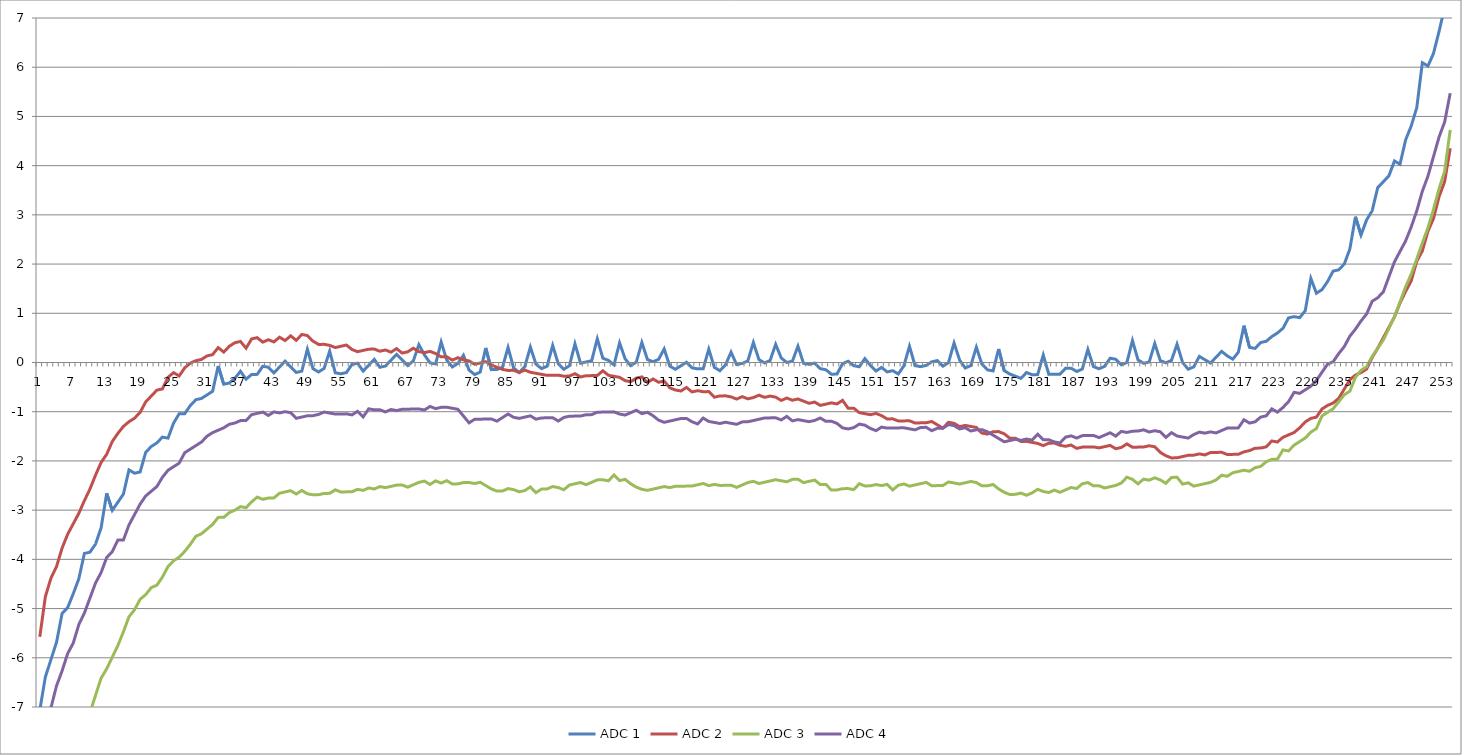
| Category | ADC 1 | ADC 2 | ADC 3 | ADC 4 |
|---|---|---|---|---|
| 0 | -7.067 | -5.575 | -10.797 | -7.813 |
| 1 | -6.389 | -4.757 | -9.909 | -7.368 |
| 2 | -6.037 | -4.382 | -9.487 | -7.016 |
| 3 | -5.685 | -4.147 | -9.042 | -6.571 |
| 4 | -5.1 | -3.771 | -8.69 | -6.266 |
| 5 | -4.981 | -3.489 | -8.338 | -5.914 |
| 6 | -4.699 | -3.277 | -8.032 | -5.701 |
| 7 | -4.394 | -3.065 | -7.634 | -5.326 |
| 8 | -3.879 | -2.807 | -7.398 | -5.091 |
| 9 | -3.853 | -2.571 | -7.116 | -4.786 |
| 10 | -3.688 | -2.289 | -6.765 | -4.48 |
| 11 | -3.359 | -2.03 | -6.413 | -4.268 |
| 12 | -2.657 | -1.865 | -6.224 | -3.963 |
| 13 | -3.005 | -1.606 | -5.988 | -3.844 |
| 14 | -2.839 | -1.441 | -5.753 | -3.609 |
| 15 | -2.674 | -1.299 | -5.471 | -3.606 |
| 16 | -2.182 | -1.203 | -5.166 | -3.301 |
| 17 | -2.25 | -1.131 | -5.024 | -3.089 |
| 18 | -2.224 | -1.012 | -4.811 | -2.877 |
| 19 | -1.826 | -0.8 | -4.716 | -2.711 |
| 20 | -1.707 | -0.681 | -4.574 | -2.616 |
| 21 | -1.635 | -0.562 | -4.525 | -2.52 |
| 22 | -1.516 | -0.537 | -4.359 | -2.331 |
| 23 | -1.537 | -0.301 | -4.147 | -2.189 |
| 24 | -1.231 | -0.206 | -4.028 | -2.117 |
| 25 | -1.043 | -0.273 | -3.956 | -2.045 |
| 26 | -1.04 | -0.108 | -3.837 | -1.833 |
| 27 | -0.875 | -0.012 | -3.695 | -1.761 |
| 28 | -0.756 | 0.037 | -3.53 | -1.688 |
| 29 | -0.73 | 0.062 | -3.481 | -1.616 |
| 30 | -0.658 | 0.134 | -3.385 | -1.497 |
| 31 | -0.586 | 0.16 | -3.29 | -1.425 |
| 32 | -0.071 | 0.302 | -3.148 | -1.376 |
| 33 | -0.441 | 0.211 | -3.145 | -1.327 |
| 34 | -0.416 | 0.33 | -3.05 | -1.255 |
| 35 | -0.32 | 0.402 | -3.001 | -1.229 |
| 36 | -0.178 | 0.428 | -2.929 | -1.18 |
| 37 | -0.339 | 0.29 | -2.95 | -1.178 |
| 38 | -0.244 | 0.479 | -2.831 | -1.059 |
| 39 | -0.241 | 0.505 | -2.735 | -1.034 |
| 40 | -0.076 | 0.414 | -2.78 | -1.008 |
| 41 | -0.097 | 0.463 | -2.754 | -1.076 |
| 42 | -0.211 | 0.418 | -2.752 | -1.004 |
| 43 | -0.092 | 0.514 | -2.656 | -1.025 |
| 44 | 0.027 | 0.446 | -2.631 | -0.999 |
| 45 | -0.088 | 0.542 | -2.605 | -1.02 |
| 46 | -0.202 | 0.451 | -2.673 | -1.134 |
| 47 | -0.176 | 0.57 | -2.6 | -1.109 |
| 48 | 0.269 | 0.549 | -2.668 | -1.083 |
| 49 | -0.125 | 0.434 | -2.689 | -1.081 |
| 50 | -0.193 | 0.367 | -2.687 | -1.055 |
| 51 | -0.12 | 0.369 | -2.661 | -1.006 |
| 52 | 0.232 | 0.348 | -2.659 | -1.027 |
| 53 | -0.209 | 0.304 | -2.587 | -1.048 |
| 54 | -0.23 | 0.329 | -2.631 | -1.046 |
| 55 | -0.204 | 0.355 | -2.629 | -1.044 |
| 56 | -0.039 | 0.264 | -2.626 | -1.065 |
| 57 | -0.013 | 0.22 | -2.577 | -0.992 |
| 58 | -0.174 | 0.245 | -2.598 | -1.107 |
| 59 | -0.055 | 0.271 | -2.549 | -0.941 |
| 60 | 0.063 | 0.273 | -2.57 | -0.962 |
| 61 | -0.097 | 0.229 | -2.522 | -0.96 |
| 62 | -0.072 | 0.255 | -2.543 | -1.004 |
| 63 | 0.047 | 0.21 | -2.517 | -0.955 |
| 64 | 0.166 | 0.282 | -2.491 | -0.976 |
| 65 | 0.052 | 0.191 | -2.489 | -0.951 |
| 66 | -0.063 | 0.217 | -2.533 | -0.948 |
| 67 | 0.033 | 0.289 | -2.484 | -0.946 |
| 68 | 0.362 | 0.222 | -2.436 | -0.944 |
| 69 | 0.154 | 0.201 | -2.41 | -0.965 |
| 70 | -0.007 | 0.226 | -2.478 | -0.893 |
| 71 | -0.028 | 0.182 | -2.405 | -0.937 |
| 72 | 0.417 | 0.114 | -2.45 | -0.911 |
| 73 | 0.047 | 0.117 | -2.401 | -0.909 |
| 74 | -0.091 | 0.049 | -2.468 | -0.93 |
| 75 | -0.019 | 0.098 | -2.466 | -0.951 |
| 76 | 0.147 | 0.054 | -2.44 | -1.089 |
| 77 | -0.154 | 0.033 | -2.438 | -1.226 |
| 78 | -0.245 | -0.035 | -2.459 | -1.154 |
| 79 | -0.196 | -0.009 | -2.434 | -1.152 |
| 80 | 0.296 | 0.016 | -2.501 | -1.149 |
| 81 | -0.145 | -0.051 | -2.569 | -1.147 |
| 82 | -0.142 | -0.096 | -2.613 | -1.191 |
| 83 | -0.093 | -0.14 | -2.611 | -1.119 |
| 84 | 0.305 | -0.161 | -2.562 | -1.047 |
| 85 | -0.112 | -0.159 | -2.583 | -1.114 |
| 86 | -0.203 | -0.203 | -2.627 | -1.135 |
| 87 | -0.084 | -0.154 | -2.602 | -1.11 |
| 88 | 0.314 | -0.199 | -2.529 | -1.084 |
| 89 | -0.033 | -0.22 | -2.644 | -1.152 |
| 90 | -0.124 | -0.241 | -2.571 | -1.126 |
| 91 | -0.075 | -0.262 | -2.569 | -1.124 |
| 92 | 0.347 | -0.259 | -2.52 | -1.122 |
| 93 | -0.024 | -0.257 | -2.541 | -1.189 |
| 94 | -0.138 | -0.278 | -2.586 | -1.117 |
| 95 | -0.066 | -0.276 | -2.49 | -1.091 |
| 96 | 0.379 | -0.227 | -2.464 | -1.089 |
| 97 | -0.015 | -0.294 | -2.439 | -1.087 |
| 98 | 0.011 | -0.269 | -2.483 | -1.061 |
| 99 | 0.037 | -0.266 | -2.434 | -1.059 |
| 100 | 0.482 | -0.264 | -2.385 | -1.01 |
| 101 | 0.088 | -0.169 | -2.383 | -1.008 |
| 102 | 0.043 | -0.26 | -2.404 | -1.005 |
| 103 | -0.047 | -0.281 | -2.285 | -1.003 |
| 104 | 0.398 | -0.302 | -2.399 | -1.047 |
| 105 | 0.074 | -0.369 | -2.374 | -1.069 |
| 106 | -0.064 | -0.39 | -2.465 | -1.02 |
| 107 | 0.008 | -0.318 | -2.532 | -0.971 |
| 108 | 0.407 | -0.292 | -2.577 | -1.038 |
| 109 | 0.06 | -0.407 | -2.598 | -1.013 |
| 110 | 0.015 | -0.334 | -2.572 | -1.08 |
| 111 | 0.064 | -0.402 | -2.547 | -1.171 |
| 112 | 0.276 | -0.376 | -2.521 | -1.216 |
| 113 | -0.071 | -0.514 | -2.542 | -1.19 |
| 114 | -0.139 | -0.558 | -2.516 | -1.164 |
| 115 | -0.067 | -0.579 | -2.514 | -1.139 |
| 116 | 0.006 | -0.507 | -2.512 | -1.136 |
| 117 | -0.109 | -0.598 | -2.509 | -1.204 |
| 118 | -0.13 | -0.572 | -2.484 | -1.248 |
| 119 | -0.127 | -0.593 | -2.458 | -1.13 |
| 120 | 0.271 | -0.591 | -2.503 | -1.197 |
| 121 | -0.099 | -0.705 | -2.477 | -1.218 |
| 122 | -0.167 | -0.68 | -2.498 | -1.239 |
| 123 | -0.048 | -0.678 | -2.496 | -1.214 |
| 124 | 0.211 | -0.699 | -2.493 | -1.235 |
| 125 | -0.044 | -0.743 | -2.538 | -1.256 |
| 126 | -0.018 | -0.694 | -2.489 | -1.207 |
| 127 | 0.031 | -0.738 | -2.44 | -1.204 |
| 128 | 0.406 | -0.713 | -2.414 | -1.179 |
| 129 | 0.059 | -0.664 | -2.459 | -1.153 |
| 130 | -0.009 | -0.708 | -2.433 | -1.128 |
| 131 | 0.04 | -0.682 | -2.407 | -1.125 |
| 132 | 0.369 | -0.703 | -2.382 | -1.123 |
| 133 | 0.091 | -0.771 | -2.403 | -1.167 |
| 134 | 0 | -0.722 | -2.424 | -1.095 |
| 135 | 0.026 | -0.766 | -2.375 | -1.186 |
| 136 | 0.331 | -0.741 | -2.373 | -1.16 |
| 137 | -0.016 | -0.785 | -2.44 | -1.181 |
| 138 | -0.037 | -0.83 | -2.415 | -1.202 |
| 139 | -0.011 | -0.804 | -2.389 | -1.177 |
| 140 | -0.126 | -0.872 | -2.48 | -1.128 |
| 141 | -0.147 | -0.846 | -2.478 | -1.196 |
| 142 | -0.238 | -0.82 | -2.592 | -1.193 |
| 143 | -0.235 | -0.841 | -2.59 | -1.238 |
| 144 | -0.023 | -0.769 | -2.564 | -1.329 |
| 145 | 0.026 | -0.93 | -2.562 | -1.35 |
| 146 | -0.065 | -0.928 | -2.583 | -1.324 |
| 147 | -0.086 | -1.019 | -2.464 | -1.252 |
| 148 | 0.079 | -1.04 | -2.508 | -1.273 |
| 149 | -0.058 | -1.061 | -2.506 | -1.34 |
| 150 | -0.173 | -1.035 | -2.48 | -1.385 |
| 151 | -0.1 | -1.079 | -2.501 | -1.312 |
| 152 | -0.191 | -1.147 | -2.476 | -1.333 |
| 153 | -0.166 | -1.145 | -2.59 | -1.331 |
| 154 | -0.233 | -1.189 | -2.494 | -1.329 |
| 155 | -0.068 | -1.187 | -2.469 | -1.327 |
| 156 | 0.331 | -1.184 | -2.513 | -1.348 |
| 157 | -0.063 | -1.229 | -2.487 | -1.369 |
| 158 | -0.084 | -1.226 | -2.462 | -1.32 |
| 159 | -0.059 | -1.224 | -2.436 | -1.317 |
| 160 | 0.014 | -1.199 | -2.504 | -1.385 |
| 161 | 0.039 | -1.266 | -2.502 | -1.336 |
| 162 | -0.075 | -1.334 | -2.499 | -1.334 |
| 163 | -0.003 | -1.215 | -2.427 | -1.262 |
| 164 | 0.396 | -1.236 | -2.448 | -1.283 |
| 165 | 0.048 | -1.304 | -2.469 | -1.35 |
| 166 | -0.112 | -1.278 | -2.443 | -1.325 |
| 167 | -0.064 | -1.299 | -2.418 | -1.392 |
| 168 | 0.312 | -1.32 | -2.439 | -1.367 |
| 169 | -0.036 | -1.434 | -2.506 | -1.364 |
| 170 | -0.15 | -1.455 | -2.504 | -1.409 |
| 171 | -0.171 | -1.406 | -2.479 | -1.476 |
| 172 | 0.274 | -1.404 | -2.569 | -1.544 |
| 173 | -0.166 | -1.448 | -2.637 | -1.612 |
| 174 | -0.234 | -1.539 | -2.681 | -1.586 |
| 175 | -0.278 | -1.537 | -2.679 | -1.56 |
| 176 | -0.323 | -1.605 | -2.654 | -1.581 |
| 177 | -0.204 | -1.602 | -2.698 | -1.556 |
| 178 | -0.248 | -1.623 | -2.649 | -1.577 |
| 179 | -0.246 | -1.644 | -2.577 | -1.458 |
| 180 | 0.153 | -1.689 | -2.621 | -1.572 |
| 181 | -0.241 | -1.64 | -2.642 | -1.57 |
| 182 | -0.239 | -1.637 | -2.593 | -1.614 |
| 183 | -0.237 | -1.682 | -2.637 | -1.635 |
| 184 | -0.118 | -1.703 | -2.589 | -1.516 |
| 185 | -0.115 | -1.677 | -2.54 | -1.491 |
| 186 | -0.183 | -1.745 | -2.561 | -1.535 |
| 187 | -0.134 | -1.719 | -2.465 | -1.486 |
| 188 | 0.264 | -1.717 | -2.439 | -1.484 |
| 189 | -0.083 | -1.715 | -2.507 | -1.482 |
| 190 | -0.127 | -1.736 | -2.505 | -1.526 |
| 191 | -0.078 | -1.71 | -2.549 | -1.477 |
| 192 | 0.087 | -1.684 | -2.524 | -1.428 |
| 193 | 0.066 | -1.752 | -2.498 | -1.496 |
| 194 | -0.048 | -1.726 | -2.449 | -1.4 |
| 195 | 0.001 | -1.654 | -2.33 | -1.421 |
| 196 | 0.446 | -1.722 | -2.374 | -1.395 |
| 197 | 0.052 | -1.72 | -2.465 | -1.393 |
| 198 | -0.016 | -1.717 | -2.37 | -1.368 |
| 199 | 0.01 | -1.692 | -2.391 | -1.412 |
| 200 | 0.385 | -1.713 | -2.342 | -1.386 |
| 201 | 0.038 | -1.827 | -2.386 | -1.407 |
| 202 | -0.006 | -1.894 | -2.454 | -1.522 |
| 203 | 0.042 | -1.939 | -2.335 | -1.426 |
| 204 | 0.371 | -1.937 | -2.333 | -1.494 |
| 205 | 0 | -1.911 | -2.47 | -1.515 |
| 206 | -0.137 | -1.885 | -2.445 | -1.536 |
| 207 | -0.088 | -1.883 | -2.512 | -1.463 |
| 208 | 0.124 | -1.857 | -2.487 | -1.415 |
| 209 | 0.056 | -1.878 | -2.461 | -1.436 |
| 210 | -0.011 | -1.829 | -2.436 | -1.41 |
| 211 | 0.107 | -1.827 | -2.387 | -1.431 |
| 212 | 0.226 | -1.825 | -2.291 | -1.382 |
| 213 | 0.135 | -1.869 | -2.312 | -1.333 |
| 214 | 0.068 | -1.867 | -2.24 | -1.331 |
| 215 | 0.21 | -1.865 | -2.214 | -1.329 |
| 216 | 0.748 | -1.816 | -2.189 | -1.163 |
| 217 | 0.308 | -1.79 | -2.21 | -1.231 |
| 218 | 0.287 | -1.741 | -2.137 | -1.205 |
| 219 | 0.406 | -1.739 | -2.112 | -1.11 |
| 220 | 0.431 | -1.713 | -2.016 | -1.084 |
| 221 | 0.527 | -1.594 | -1.967 | -0.942 |
| 222 | 0.599 | -1.615 | -1.965 | -1.009 |
| 223 | 0.694 | -1.52 | -1.776 | -0.914 |
| 224 | 0.907 | -1.471 | -1.797 | -0.795 |
| 225 | 0.932 | -1.422 | -1.678 | -0.606 |
| 226 | 0.911 | -1.327 | -1.606 | -0.627 |
| 227 | 1.053 | -1.208 | -1.534 | -0.555 |
| 228 | 1.708 | -1.135 | -1.415 | -0.483 |
| 229 | 1.408 | -1.11 | -1.343 | -0.364 |
| 230 | 1.48 | -0.944 | -1.084 | -0.199 |
| 231 | 1.645 | -0.872 | -1.012 | -0.033 |
| 232 | 1.857 | -0.823 | -0.94 | 0.016 |
| 233 | 1.883 | -0.728 | -0.798 | 0.181 |
| 234 | 2.002 | -0.539 | -0.655 | 0.323 |
| 235 | 2.307 | -0.35 | -0.583 | 0.536 |
| 236 | 2.962 | -0.255 | -0.301 | 0.678 |
| 237 | 2.591 | -0.206 | -0.159 | 0.843 |
| 238 | 2.897 | -0.133 | -0.087 | 0.985 |
| 239 | 3.085 | 0.102 | 0.125 | 1.244 |
| 240 | 3.554 | 0.291 | 0.291 | 1.316 |
| 241 | 3.673 | 0.503 | 0.456 | 1.435 |
| 242 | 3.792 | 0.715 | 0.692 | 1.74 |
| 243 | 4.097 | 0.927 | 0.927 | 2.046 |
| 244 | 4.029 | 1.209 | 1.232 | 2.258 |
| 245 | 4.521 | 1.444 | 1.538 | 2.47 |
| 246 | 4.803 | 1.656 | 1.796 | 2.752 |
| 247 | 5.178 | 2.055 | 2.102 | 3.081 |
| 248 | 6.09 | 2.267 | 2.43 | 3.479 |
| 249 | 6.022 | 2.666 | 2.736 | 3.784 |
| 250 | 6.281 | 2.924 | 3.111 | 4.183 |
| 251 | 6.726 | 3.369 | 3.533 | 4.582 |
| 252 | 7.218 | 3.675 | 3.885 | 4.887 |
| 253 | 7.71 | 4.353 | 4.726 | 5.472 |